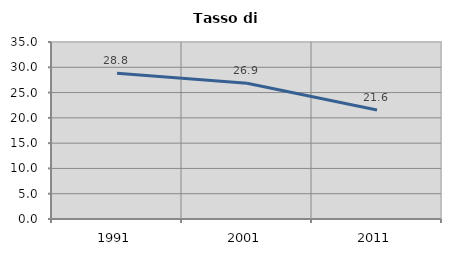
| Category | Tasso di disoccupazione   |
|---|---|
| 1991.0 | 28.814 |
| 2001.0 | 26.857 |
| 2011.0 | 21.564 |